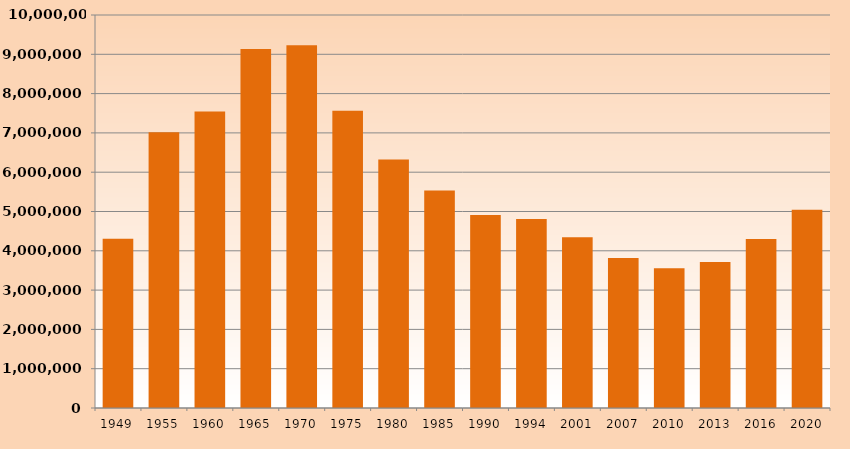
| Category | Series 1 |
|---|---|
| 1949.0 | 4303679 |
| 1955.0 | 7018486 |
| 1960.0 | 7545453 |
| 1965.0 | 9134214 |
| 1970.0 | 9228078 |
| 1975.0 | 7560445 |
| 1980.0 | 6321123 |
| 1985.0 | 5537355 |
| 1990.0 | 4912724 |
| 1994.0 | 4807709 |
| 2001.0 | 4342899 |
| 2007.0 | 3815817 |
| 2010.0 | 3558638 |
| 2013.0 | 3716000 |
| 2016.0 | 4302965 |
| 2020.0 | 5041560 |